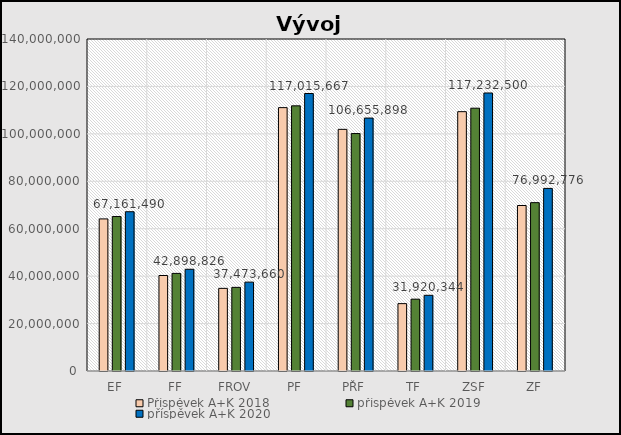
| Category | Příspěvek A+K 2018 | příspěvek A+K 2019 | příspěvek A+K 2020 |
|---|---|---|---|
| EF | 64133638 | 65131486 | 67161489.741 |
| FF | 40266178 | 41157952 | 42898825.696 |
| FROV | 34845080 | 35265075 | 37473660.077 |
| PF | 111057956 | 111813632 | 117015667.178 |
| PŘF | 101897204 | 100129209 | 106655897.862 |
| TF | 28405865 | 30284794 | 31920343.908 |
| ZSF | 109360257 | 110819742 | 117232500.089 |
| ZF | 69787412 | 70988657 | 76992775.847 |